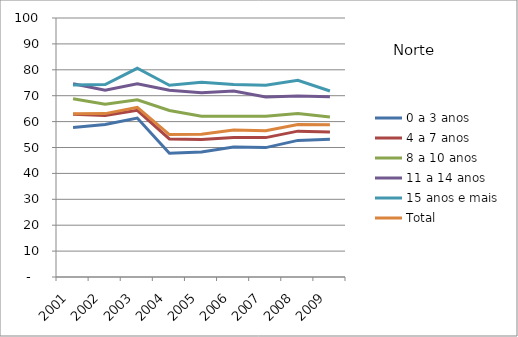
| Category | 0 a 3 anos | 4 a 7 anos | 8 a 10 anos | 11 a 14 anos | 15 anos e mais | Total |
|---|---|---|---|---|---|---|
| 2001.0 | 57.75 | 62.83 | 68.85 | 74.62 | 74.13 | 63.07 |
| 2002.0 | 58.92 | 62.38 | 66.72 | 72.16 | 74.31 | 63.08 |
| 2003.0 | 61.37 | 64.37 | 68.44 | 74.57 | 80.58 | 65.51 |
| 2004.0 | 47.77 | 53.32 | 64.31 | 72.09 | 74.05 | 54.99 |
| 2005.0 | 48.23 | 53.11 | 62.07 | 71.12 | 75.2 | 55.16 |
| 2006.0 | 50.17 | 53.86 | 62.03 | 71.78 | 74.29 | 56.76 |
| 2007.0 | 49.96 | 53.82 | 62.07 | 69.46 | 74.02 | 56.45 |
| 2008.0 | 52.74 | 56.32 | 63.12 | 69.84 | 75.92 | 58.88 |
| 2009.0 | 53.23 | 56.01 | 61.76 | 69.55 | 71.82 | 58.77 |